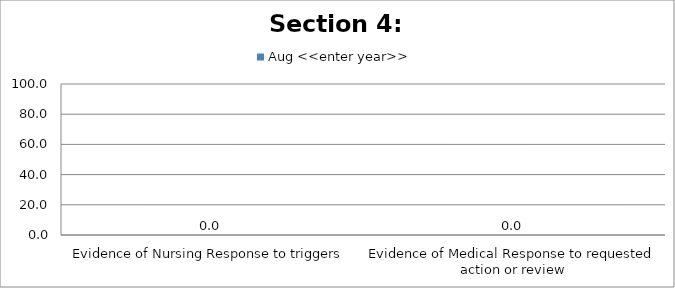
| Category | Aug <<enter year>> |
|---|---|
| Evidence of Nursing Response to triggers | 0 |
| Evidence of Medical Response to requested action or review | 0 |